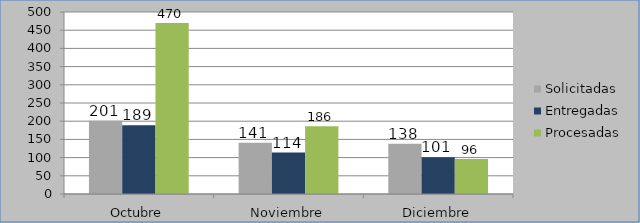
| Category | Solicitadas | Entregadas | Procesadas |
|---|---|---|---|
| Octubre | 201 | 189 | 470 |
| Noviembre | 141 | 114 | 186 |
| Diciembre | 138 | 101 | 96 |